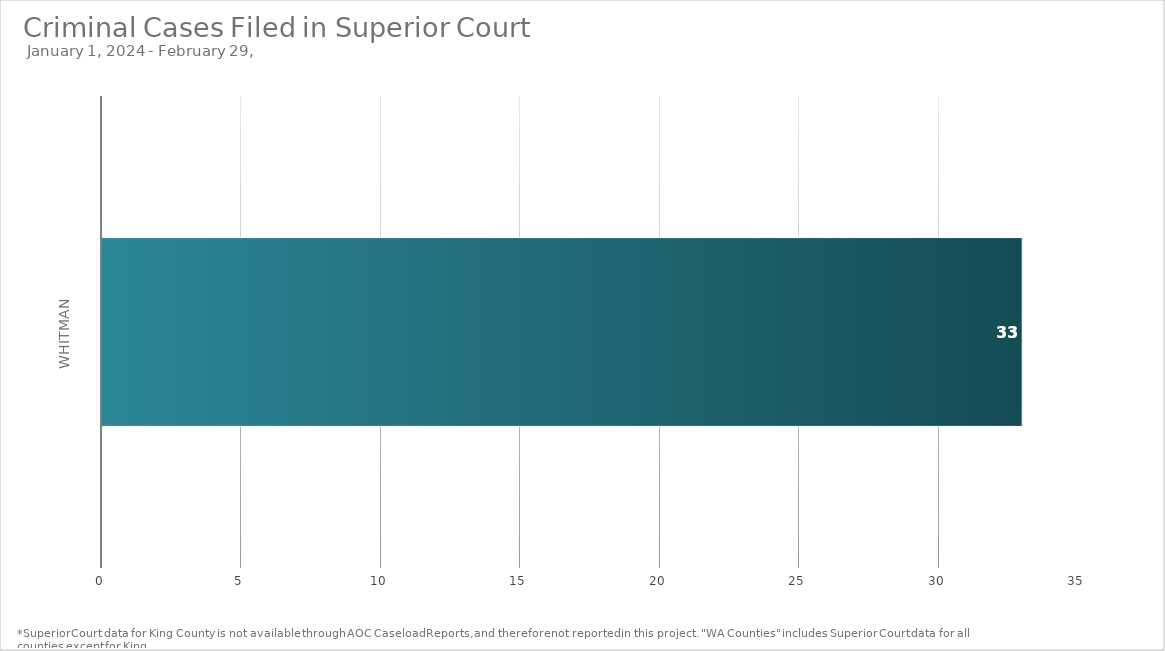
| Category | Total |
|---|---|
| Whitman | 33 |